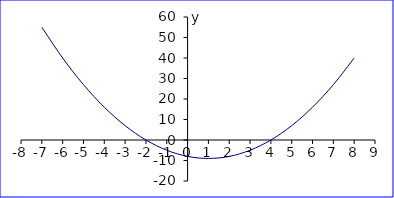
| Category | y |
|---|---|
| -7.0 | 55 |
| -6.0 | 40 |
| -5.0 | 27 |
| -4.0 | 16 |
| -3.0 | 7 |
| -2.0 | 0 |
| -1.0 | -5 |
| 0.0 | -8 |
| 1.0 | -9 |
| 2.0 | -8 |
| 3.0 | -5 |
| 4.0 | 0 |
| 5.0 | 7 |
| 6.0 | 16 |
| 7.0 | 27 |
| 8.0 | 40 |